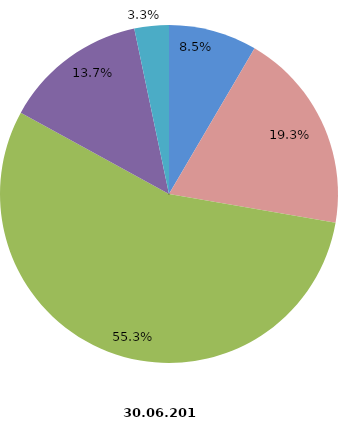
| Category | Beschäftigte 2016 |
|---|---|
| tätige Inhaber und Mitinhaber sowie unbezahlt mithelfende Familienangehörige | 2282 |
| kaufmännische und technische Arbeitnehmer | 5198 |
| Facharbeiter | 14918 |
| Fachwerker und Werker | 3705 |
| gewerblich Auszubildende, Umschüler, Praktikanten | 890 |